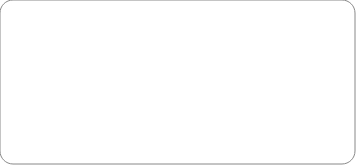
| Category | Series 0 |
|---|---|
| Immediate | 0 |
| Very High | 0 |
| High | 0 |
| Medium | 0 |
| Low | 0 |
| Very Low | 0 |
| On Hold | 0 |
| Impossibru | 0 |
| Done | 0 |